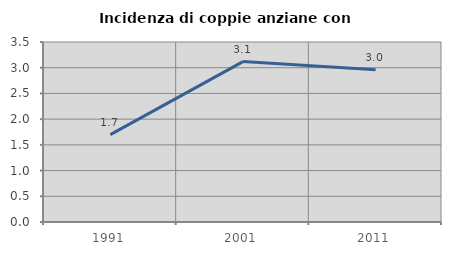
| Category | Incidenza di coppie anziane con figli |
|---|---|
| 1991.0 | 1.7 |
| 2001.0 | 3.119 |
| 2011.0 | 2.958 |